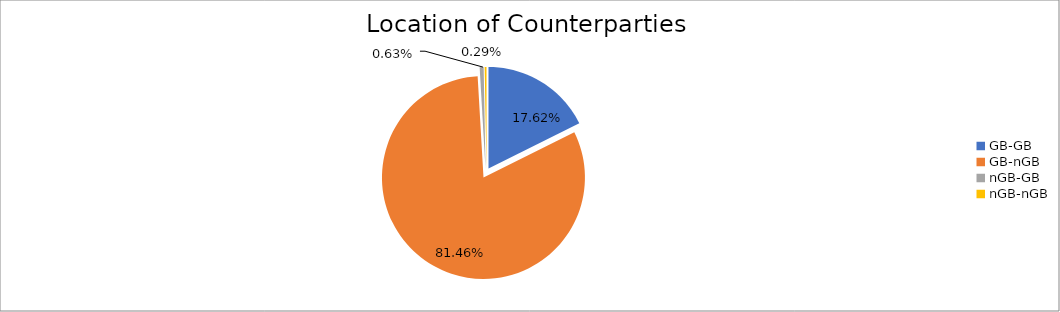
| Category | Series 0 |
|---|---|
| GB-GB | 1705378.843 |
| GB-nGB | 7882139.437 |
| nGB-GB | 61038.798 |
| nGB-nGB | 27982.876 |